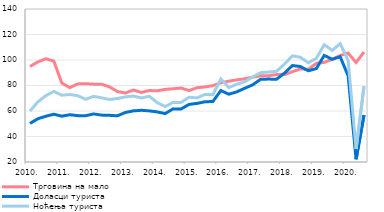
| Category | Трговина на мало | Доласци туриста | Ноћења туриста  |
|---|---|---|---|
| 2010. | 94.925 | 50.266 | 59.973 |
| II | 98.522 | 53.953 | 67.226 |
| III | 100.975 | 55.9 | 72.043 |
| IV | 99.107 | 57.473 | 75.355 |
| 2011. | 81.945 | 55.923 | 72.373 |
| II | 78.324 | 57.088 | 72.922 |
| III | 81.25 | 56.36 | 72.063 |
| IV | 81.428 | 56.282 | 69.176 |
| 2012. | 81.061 | 57.704 | 71.507 |
| II | 81.054 | 56.781 | 70.322 |
| III | 78.874 | 56.611 | 69.056 |
| IV | 75.235 | 56.235 | 69.806 |
| 2013. | 74.11 | 58.857 | 71.076 |
| II | 76.461 | 60.093 | 71.717 |
| III | 74.547 | 60.562 | 70.226 |
| IV | 76.072 | 60.081 | 71.573 |
| 2014. | 75.802 | 59.283 | 66.563 |
| II | 76.983 | 57.981 | 63.49 |
| III | 77.418 | 61.67 | 66.741 |
| IV | 78.034 | 61.577 | 66.69 |
| 2015. | 76.023 | 65.171 | 70.801 |
| II | 78.274 | 65.969 | 70.274 |
| III | 78.85 | 67.222 | 73.025 |
| IV | 79.908 | 67.47 | 72.89 |
| 2016. | 82.068 | 76.07 | 85.097 |
| II | 83.41 | 73.152 | 78.396 |
| III | 84.415 | 75.017 | 80.989 |
| IV | 85.268 | 77.824 | 82.945 |
| 2017. | 86.507 | 80.516 | 86.721 |
| II | 87.676 | 84.849 | 90.058 |
| III | 87.684 | 85.041 | 90.566 |
| IV | 88.567 | 84.884 | 91.156 |
| 2018. | 88.542 | 89.696 | 96.749 |
| II | 90.825 | 95.668 | 103.345 |
| III | 92.994 | 94.867 | 102.099 |
| IV | 92.653 | 91.522 | 97.807 |
| 2019. | 97.386 | 93.267 | 101.31 |
| II | 98.143 | 103.627 | 111.998 |
| III | 100.566 | 100.55 | 107.535 |
| IV | 103.509 | 102.556 | 112.84 |
| 2020. | 105.413 | 87.646 | 99.77 |
| II | 98.075 | 22.121 | 30.164 |
| III | 106.278 | 56.945 | 79.399 |